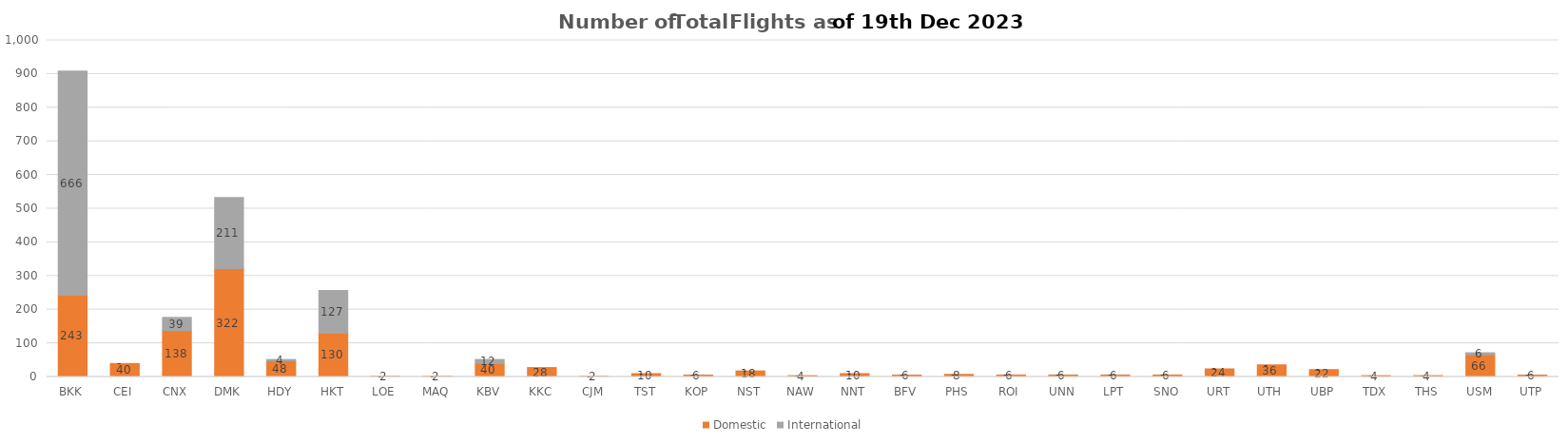
| Category | Domestic | International |
|---|---|---|
| BKK | 243 | 666 |
| CEI | 40 | 0 |
| CNX | 138 | 39 |
| DMK | 322 | 211 |
| HDY | 48 | 4 |
| HKT | 130 | 127 |
| LOE | 2 | 0 |
| MAQ | 2 | 0 |
| KBV | 40 | 12 |
| KKC | 28 | 0 |
| CJM | 2 | 0 |
| TST | 10 | 0 |
| KOP | 6 | 0 |
| NST | 18 | 0 |
| NAW | 4 | 0 |
| NNT | 10 | 0 |
| BFV | 6 | 0 |
| PHS | 8 | 0 |
| ROI | 6 | 0 |
| UNN | 6 | 0 |
| LPT | 6 | 0 |
| SNO | 6 | 0 |
| URT | 24 | 0 |
| UTH | 36 | 0 |
| UBP | 22 | 0 |
| TDX | 4 | 0 |
| THS | 4 | 0 |
| USM | 66 | 6 |
| UTP | 6 | 0 |